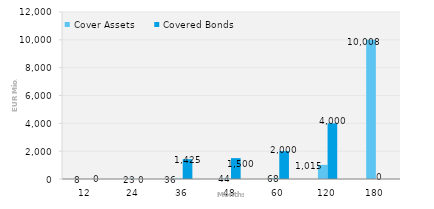
| Category | Cover Assets | Covered Bonds |
|---|---|---|
| 12.0 | 7.736 | 0 |
| 24.0 | 22.612 | 0 |
| 36.0 | 35.508 | 1425 |
| 48.0 | 43.58 | 1500 |
| 60.0 | 68.229 | 2000 |
| 120.0 | 1014.898 | 4000 |
| 180.0 | 10007.946 | 0 |